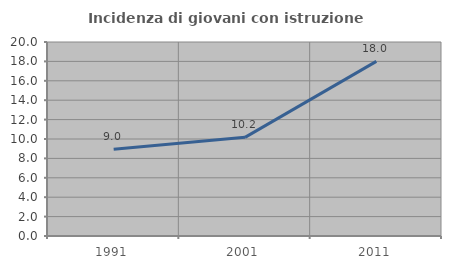
| Category | Incidenza di giovani con istruzione universitaria |
|---|---|
| 1991.0 | 8.955 |
| 2001.0 | 10.169 |
| 2011.0 | 18 |